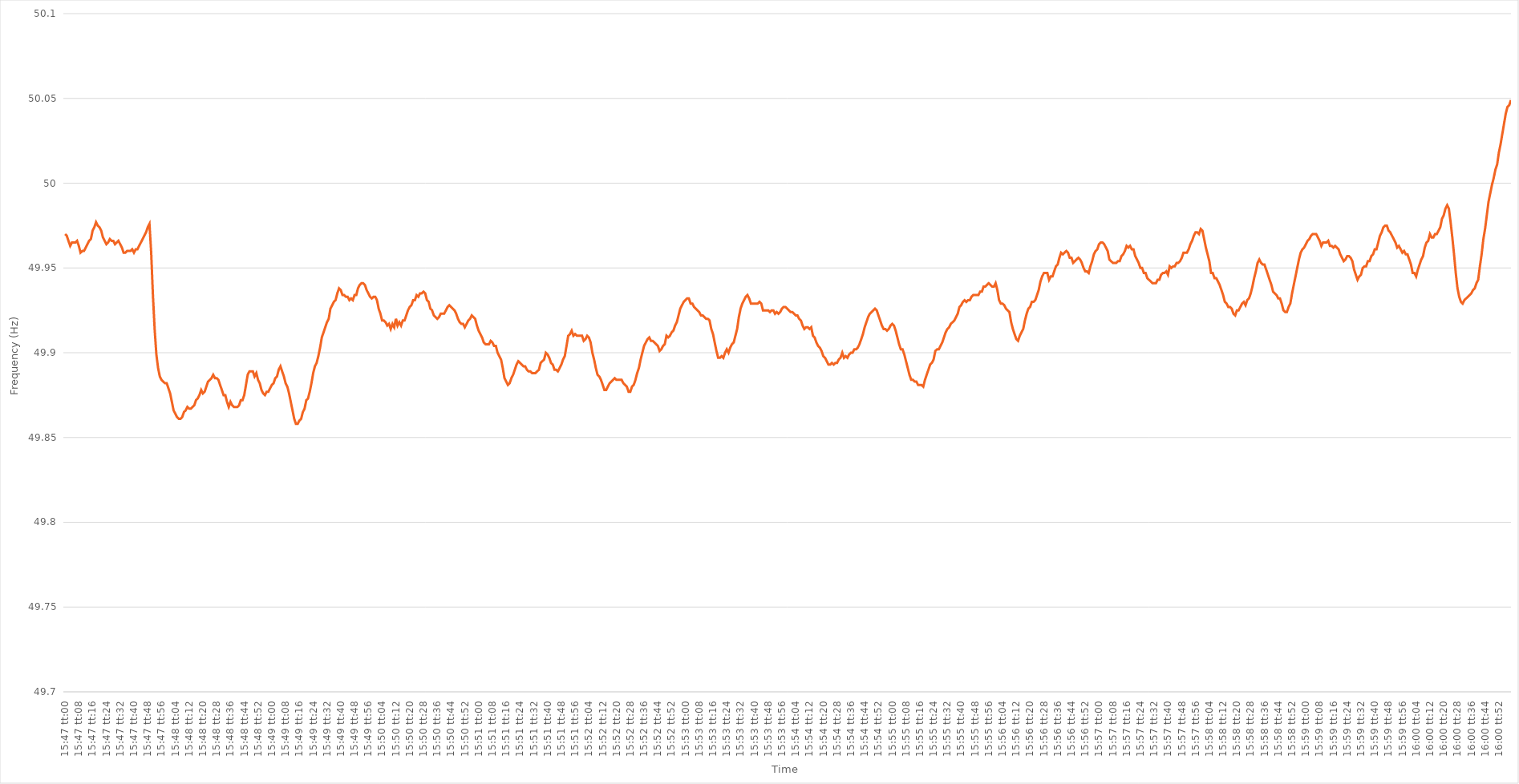
| Category | Series 0 |
|---|---|
| 0.6576388888888889 | 49.97 |
| 0.657650462962963 | 49.969 |
| 0.6576620370370371 | 49.966 |
| 0.6576736111111111 | 49.963 |
| 0.6576851851851852 | 49.965 |
| 0.6576967592592592 | 49.965 |
| 0.6577083333333333 | 49.965 |
| 0.6577199074074074 | 49.966 |
| 0.6577314814814815 | 49.963 |
| 0.6577430555555556 | 49.959 |
| 0.6577546296296296 | 49.96 |
| 0.6577662037037036 | 49.96 |
| 0.6577777777777778 | 49.962 |
| 0.6577893518518518 | 49.964 |
| 0.657800925925926 | 49.966 |
| 0.6578125 | 49.967 |
| 0.6578240740740741 | 49.972 |
| 0.6578356481481481 | 49.974 |
| 0.6578472222222222 | 49.977 |
| 0.6578587962962963 | 49.975 |
| 0.6578703703703704 | 49.974 |
| 0.6578819444444445 | 49.972 |
| 0.6578935185185185 | 49.968 |
| 0.6579050925925926 | 49.966 |
| 0.6579166666666666 | 49.964 |
| 0.6579282407407407 | 49.965 |
| 0.6579398148148148 | 49.967 |
| 0.6579513888888889 | 49.966 |
| 0.657962962962963 | 49.966 |
| 0.657974537037037 | 49.964 |
| 0.657986111111111 | 49.965 |
| 0.6579976851851852 | 49.966 |
| 0.6580092592592592 | 49.964 |
| 0.6580208333333334 | 49.962 |
| 0.6580324074074074 | 49.959 |
| 0.6580439814814815 | 49.959 |
| 0.6580555555555555 | 49.96 |
| 0.6580671296296297 | 49.96 |
| 0.6580787037037037 | 49.96 |
| 0.6580902777777778 | 49.961 |
| 0.6581018518518519 | 49.959 |
| 0.6581134259259259 | 49.961 |
| 0.658125 | 49.961 |
| 0.6581365740740741 | 49.963 |
| 0.6581481481481481 | 49.965 |
| 0.6581597222222222 | 49.967 |
| 0.6581712962962963 | 49.969 |
| 0.6581828703703704 | 49.971 |
| 0.6581944444444444 | 49.974 |
| 0.6582060185185185 | 49.976 |
| 0.6582175925925926 | 49.959 |
| 0.6582291666666666 | 49.934 |
| 0.6582407407407408 | 49.914 |
| 0.6582523148148148 | 49.899 |
| 0.6582638888888889 | 49.891 |
| 0.6582754629629629 | 49.886 |
| 0.6582870370370371 | 49.884 |
| 0.6582986111111111 | 49.883 |
| 0.6583101851851852 | 49.882 |
| 0.6583217592592593 | 49.882 |
| 0.6583333333333333 | 49.879 |
| 0.6583449074074074 | 49.876 |
| 0.6583564814814815 | 49.871 |
| 0.6583680555555556 | 49.866 |
| 0.6583796296296297 | 49.864 |
| 0.6583912037037037 | 49.862 |
| 0.6584027777777778 | 49.861 |
| 0.6584143518518518 | 49.861 |
| 0.6584259259259259 | 49.862 |
| 0.6584375 | 49.865 |
| 0.658449074074074 | 49.866 |
| 0.6584606481481482 | 49.868 |
| 0.6584722222222222 | 49.867 |
| 0.6584837962962963 | 49.867 |
| 0.6584953703703703 | 49.868 |
| 0.6585069444444445 | 49.869 |
| 0.6585185185185185 | 49.872 |
| 0.6585300925925927 | 49.873 |
| 0.6585416666666667 | 49.875 |
| 0.6585532407407407 | 49.878 |
| 0.6585648148148148 | 49.876 |
| 0.6585763888888889 | 49.877 |
| 0.658587962962963 | 49.88 |
| 0.6585995370370371 | 49.883 |
| 0.6586111111111111 | 49.884 |
| 0.6586226851851852 | 49.885 |
| 0.6586342592592592 | 49.887 |
| 0.6586458333333333 | 49.885 |
| 0.6586574074074074 | 49.885 |
| 0.6586689814814815 | 49.884 |
| 0.6586805555555556 | 49.881 |
| 0.6586921296296296 | 49.878 |
| 0.6587037037037037 | 49.875 |
| 0.6587152777777777 | 49.875 |
| 0.6587268518518519 | 49.871 |
| 0.6587384259259259 | 49.868 |
| 0.6587500000000001 | 49.871 |
| 0.6587615740740741 | 49.869 |
| 0.6587731481481481 | 49.868 |
| 0.6587847222222222 | 49.868 |
| 0.6587962962962963 | 49.868 |
| 0.6588078703703704 | 49.869 |
| 0.6588194444444445 | 49.872 |
| 0.6588310185185186 | 49.872 |
| 0.6588425925925926 | 49.875 |
| 0.6588541666666666 | 49.881 |
| 0.6588657407407407 | 49.887 |
| 0.6588773148148148 | 49.889 |
| 0.6588888888888889 | 49.889 |
| 0.658900462962963 | 49.889 |
| 0.658912037037037 | 49.886 |
| 0.6589236111111111 | 49.888 |
| 0.6589351851851851 | 49.884 |
| 0.6589467592592593 | 49.882 |
| 0.6589583333333333 | 49.878 |
| 0.6589699074074075 | 49.876 |
| 0.6589814814814815 | 49.875 |
| 0.6589930555555555 | 49.877 |
| 0.6590046296296296 | 49.877 |
| 0.6590162037037037 | 49.879 |
| 0.6590277777777778 | 49.881 |
| 0.6590393518518519 | 49.882 |
| 0.659050925925926 | 49.885 |
| 0.6590625 | 49.886 |
| 0.659074074074074 | 49.89 |
| 0.6590856481481482 | 49.892 |
| 0.6590972222222222 | 49.889 |
| 0.6591087962962963 | 49.886 |
| 0.6591203703703704 | 49.882 |
| 0.6591319444444445 | 49.88 |
| 0.6591435185185185 | 49.876 |
| 0.6591550925925925 | 49.871 |
| 0.6591666666666667 | 49.866 |
| 0.6591782407407407 | 49.861 |
| 0.6591898148148149 | 49.858 |
| 0.6592013888888889 | 49.858 |
| 0.659212962962963 | 49.86 |
| 0.659224537037037 | 49.861 |
| 0.6592361111111111 | 49.865 |
| 0.6592476851851852 | 49.867 |
| 0.6592592592592593 | 49.872 |
| 0.6592708333333334 | 49.873 |
| 0.6592824074074074 | 49.877 |
| 0.6592939814814814 | 49.882 |
| 0.6593055555555556 | 49.888 |
| 0.6593171296296296 | 49.892 |
| 0.6593287037037037 | 49.894 |
| 0.6593402777777778 | 49.898 |
| 0.6593518518518519 | 49.903 |
| 0.6593634259259259 | 49.909 |
| 0.6593749999999999 | 49.912 |
| 0.6593865740740741 | 49.915 |
| 0.6593981481481481 | 49.918 |
| 0.6594097222222223 | 49.92 |
| 0.6594212962962963 | 49.926 |
| 0.6594328703703703 | 49.928 |
| 0.6594444444444444 | 49.93 |
| 0.6594560185185185 | 49.931 |
| 0.6594675925925926 | 49.935 |
| 0.6594791666666667 | 49.938 |
| 0.6594907407407408 | 49.937 |
| 0.6595023148148148 | 49.934 |
| 0.6595138888888888 | 49.934 |
| 0.659525462962963 | 49.933 |
| 0.659537037037037 | 49.933 |
| 0.6595486111111112 | 49.931 |
| 0.6595601851851852 | 49.932 |
| 0.6595717592592593 | 49.931 |
| 0.6595833333333333 | 49.934 |
| 0.6595949074074073 | 49.934 |
| 0.6596064814814815 | 49.938 |
| 0.6596180555555555 | 49.94 |
| 0.6596296296296297 | 49.941 |
| 0.6596412037037037 | 49.941 |
| 0.6596527777777778 | 49.94 |
| 0.6596643518518518 | 49.937 |
| 0.6596759259259259 | 49.935 |
| 0.6596875 | 49.933 |
| 0.6596990740740741 | 49.932 |
| 0.6597106481481482 | 49.933 |
| 0.6597222222222222 | 49.933 |
| 0.6597337962962962 | 49.931 |
| 0.6597453703703704 | 49.926 |
| 0.6597569444444444 | 49.923 |
| 0.6597685185185186 | 49.919 |
| 0.6597800925925926 | 49.919 |
| 0.6597916666666667 | 49.918 |
| 0.6598032407407407 | 49.916 |
| 0.6598148148148147 | 49.917 |
| 0.6598263888888889 | 49.914 |
| 0.6598379629629629 | 49.917 |
| 0.6598495370370371 | 49.915 |
| 0.6598611111111111 | 49.92 |
| 0.6598726851851852 | 49.916 |
| 0.6598842592592592 | 49.918 |
| 0.6598958333333333 | 49.916 |
| 0.6599074074074074 | 49.919 |
| 0.6599189814814815 | 49.919 |
| 0.6599305555555556 | 49.922 |
| 0.6599421296296296 | 49.925 |
| 0.6599537037037037 | 49.927 |
| 0.6599652777777778 | 49.928 |
| 0.6599768518518518 | 49.931 |
| 0.659988425925926 | 49.931 |
| 0.66 | 49.934 |
| 0.6600115740740741 | 49.933 |
| 0.6600231481481481 | 49.935 |
| 0.6600347222222223 | 49.935 |
| 0.6600462962962963 | 49.936 |
| 0.6600578703703703 | 49.935 |
| 0.6600694444444445 | 49.931 |
| 0.6600810185185185 | 49.93 |
| 0.6600925925925926 | 49.926 |
| 0.6601041666666666 | 49.925 |
| 0.6601157407407408 | 49.922 |
| 0.6601273148148148 | 49.921 |
| 0.6601388888888889 | 49.92 |
| 0.660150462962963 | 49.921 |
| 0.660162037037037 | 49.923 |
| 0.6601736111111111 | 49.923 |
| 0.6601851851851852 | 49.923 |
| 0.6601967592592592 | 49.925 |
| 0.6602083333333334 | 49.927 |
| 0.6602199074074074 | 49.928 |
| 0.6602314814814815 | 49.927 |
| 0.6602430555555555 | 49.926 |
| 0.6602546296296297 | 49.925 |
| 0.6602662037037037 | 49.923 |
| 0.6602777777777777 | 49.92 |
| 0.6602893518518519 | 49.918 |
| 0.6603009259259259 | 49.917 |
| 0.6603125 | 49.917 |
| 0.660324074074074 | 49.915 |
| 0.6603356481481482 | 49.917 |
| 0.6603472222222222 | 49.919 |
| 0.6603587962962963 | 49.92 |
| 0.6603703703703704 | 49.922 |
| 0.6603819444444444 | 49.921 |
| 0.6603935185185185 | 49.92 |
| 0.6604050925925926 | 49.916 |
| 0.6604166666666667 | 49.913 |
| 0.6604282407407408 | 49.911 |
| 0.6604398148148148 | 49.909 |
| 0.6604513888888889 | 49.906 |
| 0.6604629629629629 | 49.905 |
| 0.6604745370370371 | 49.905 |
| 0.6604861111111111 | 49.905 |
| 0.6604976851851853 | 49.907 |
| 0.6605092592592593 | 49.906 |
| 0.6605208333333333 | 49.904 |
| 0.6605324074074074 | 49.904 |
| 0.6605439814814814 | 49.9 |
| 0.6605555555555556 | 49.898 |
| 0.6605671296296296 | 49.896 |
| 0.6605787037037038 | 49.891 |
| 0.6605902777777778 | 49.885 |
| 0.6606018518518518 | 49.883 |
| 0.6606134259259259 | 49.881 |
| 0.660625 | 49.882 |
| 0.6606365740740741 | 49.885 |
| 0.6606481481481482 | 49.887 |
| 0.6606597222222222 | 49.89 |
| 0.6606712962962963 | 49.893 |
| 0.6606828703703703 | 49.895 |
| 0.6606944444444445 | 49.894 |
| 0.6607060185185185 | 49.893 |
| 0.6607175925925927 | 49.892 |
| 0.6607291666666667 | 49.892 |
| 0.6607407407407407 | 49.89 |
| 0.6607523148148148 | 49.889 |
| 0.6607638888888888 | 49.889 |
| 0.660775462962963 | 49.888 |
| 0.660787037037037 | 49.888 |
| 0.6607986111111112 | 49.888 |
| 0.6608101851851852 | 49.889 |
| 0.6608217592592592 | 49.89 |
| 0.6608333333333333 | 49.894 |
| 0.6608449074074074 | 49.895 |
| 0.6608564814814815 | 49.896 |
| 0.6608680555555556 | 49.9 |
| 0.6608796296296297 | 49.899 |
| 0.6608912037037037 | 49.897 |
| 0.6609027777777777 | 49.894 |
| 0.6609143518518519 | 49.893 |
| 0.6609259259259259 | 49.89 |
| 0.6609375000000001 | 49.89 |
| 0.6609490740740741 | 49.889 |
| 0.6609606481481481 | 49.891 |
| 0.6609722222222222 | 49.893 |
| 0.6609837962962963 | 49.896 |
| 0.6609953703703704 | 49.898 |
| 0.6610069444444444 | 49.904 |
| 0.6610185185185186 | 49.91 |
| 0.6610300925925926 | 49.911 |
| 0.6610416666666666 | 49.913 |
| 0.6610532407407407 | 49.91 |
| 0.6610648148148148 | 49.911 |
| 0.6610763888888889 | 49.91 |
| 0.661087962962963 | 49.91 |
| 0.661099537037037 | 49.91 |
| 0.6611111111111111 | 49.91 |
| 0.6611226851851851 | 49.907 |
| 0.6611342592592593 | 49.908 |
| 0.6611458333333333 | 49.91 |
| 0.6611574074074075 | 49.909 |
| 0.6611689814814815 | 49.906 |
| 0.6611805555555555 | 49.9 |
| 0.6611921296296296 | 49.896 |
| 0.6612037037037037 | 49.891 |
| 0.6612152777777778 | 49.887 |
| 0.6612268518518518 | 49.886 |
| 0.661238425925926 | 49.884 |
| 0.66125 | 49.881 |
| 0.661261574074074 | 49.878 |
| 0.6612731481481481 | 49.878 |
| 0.6612847222222222 | 49.88 |
| 0.6612962962962963 | 49.882 |
| 0.6613078703703704 | 49.883 |
| 0.6613194444444445 | 49.884 |
| 0.6613310185185185 | 49.885 |
| 0.6613425925925925 | 49.884 |
| 0.6613541666666667 | 49.884 |
| 0.6613657407407407 | 49.884 |
| 0.6613773148148149 | 49.884 |
| 0.6613888888888889 | 49.882 |
| 0.661400462962963 | 49.881 |
| 0.661412037037037 | 49.88 |
| 0.6614236111111111 | 49.877 |
| 0.6614351851851852 | 49.877 |
| 0.6614467592592593 | 49.88 |
| 0.6614583333333334 | 49.881 |
| 0.6614699074074074 | 49.884 |
| 0.6614814814814814 | 49.888 |
| 0.6614930555555555 | 49.891 |
| 0.6615046296296296 | 49.896 |
| 0.6615162037037037 | 49.9 |
| 0.6615277777777778 | 49.904 |
| 0.6615393518518519 | 49.906 |
| 0.6615509259259259 | 49.908 |
| 0.6615624999999999 | 49.909 |
| 0.6615740740740741 | 49.907 |
| 0.6615856481481481 | 49.907 |
| 0.6615972222222223 | 49.906 |
| 0.6616087962962963 | 49.905 |
| 0.6616203703703704 | 49.904 |
| 0.6616319444444444 | 49.901 |
| 0.6616435185185185 | 49.902 |
| 0.6616550925925926 | 49.904 |
| 0.6616666666666667 | 49.905 |
| 0.6616782407407408 | 49.91 |
| 0.6616898148148148 | 49.909 |
| 0.6617013888888889 | 49.91 |
| 0.6617129629629629 | 49.912 |
| 0.661724537037037 | 49.913 |
| 0.6617361111111111 | 49.916 |
| 0.6617476851851852 | 49.918 |
| 0.6617592592592593 | 49.922 |
| 0.6617708333333333 | 49.926 |
| 0.6617824074074073 | 49.928 |
| 0.6617939814814815 | 49.93 |
| 0.6618055555555555 | 49.931 |
| 0.6618171296296297 | 49.932 |
| 0.6618287037037037 | 49.932 |
| 0.6618402777777778 | 49.929 |
| 0.6618518518518518 | 49.929 |
| 0.661863425925926 | 49.927 |
| 0.661875 | 49.926 |
| 0.6618865740740741 | 49.925 |
| 0.6618981481481482 | 49.924 |
| 0.6619097222222222 | 49.922 |
| 0.6619212962962963 | 49.922 |
| 0.6619328703703703 | 49.921 |
| 0.6619444444444444 | 49.92 |
| 0.6619560185185185 | 49.92 |
| 0.6619675925925926 | 49.919 |
| 0.6619791666666667 | 49.914 |
| 0.6619907407407407 | 49.911 |
| 0.6620023148148148 | 49.906 |
| 0.6620138888888889 | 49.901 |
| 0.6620254629629629 | 49.897 |
| 0.6620370370370371 | 49.897 |
| 0.6620486111111111 | 49.898 |
| 0.6620601851851852 | 49.897 |
| 0.6620717592592592 | 49.9 |
| 0.6620833333333334 | 49.902 |
| 0.6620949074074074 | 49.9 |
| 0.6621064814814815 | 49.903 |
| 0.6621180555555556 | 49.905 |
| 0.6621296296296296 | 49.906 |
| 0.6621412037037037 | 49.91 |
| 0.6621527777777778 | 49.914 |
| 0.6621643518518519 | 49.921 |
| 0.6621759259259259 | 49.926 |
| 0.6621875 | 49.929 |
| 0.6621990740740741 | 49.931 |
| 0.6622106481481481 | 49.933 |
| 0.6622222222222222 | 49.934 |
| 0.6622337962962963 | 49.932 |
| 0.6622453703703703 | 49.929 |
| 0.6622569444444445 | 49.929 |
| 0.6622685185185185 | 49.929 |
| 0.6622800925925926 | 49.929 |
| 0.6622916666666666 | 49.929 |
| 0.6623032407407408 | 49.93 |
| 0.6623148148148148 | 49.929 |
| 0.662326388888889 | 49.925 |
| 0.662337962962963 | 49.925 |
| 0.662349537037037 | 49.925 |
| 0.6623611111111111 | 49.925 |
| 0.6623726851851852 | 49.924 |
| 0.6623842592592593 | 49.925 |
| 0.6623958333333334 | 49.925 |
| 0.6624074074074074 | 49.923 |
| 0.6624189814814815 | 49.924 |
| 0.6624305555555555 | 49.923 |
| 0.6624421296296296 | 49.924 |
| 0.6624537037037037 | 49.926 |
| 0.6624652777777778 | 49.927 |
| 0.6624768518518519 | 49.927 |
| 0.6624884259259259 | 49.926 |
| 0.6625 | 49.925 |
| 0.662511574074074 | 49.924 |
| 0.6625231481481482 | 49.924 |
| 0.6625347222222222 | 49.923 |
| 0.6625462962962964 | 49.922 |
| 0.6625578703703704 | 49.922 |
| 0.6625694444444444 | 49.92 |
| 0.6625810185185185 | 49.919 |
| 0.6625925925925926 | 49.916 |
| 0.6626041666666667 | 49.914 |
| 0.6626157407407408 | 49.915 |
| 0.6626273148148148 | 49.915 |
| 0.6626388888888889 | 49.914 |
| 0.6626504629629629 | 49.915 |
| 0.662662037037037 | 49.91 |
| 0.6626736111111111 | 49.909 |
| 0.6626851851851852 | 49.906 |
| 0.6626967592592593 | 49.904 |
| 0.6627083333333333 | 49.903 |
| 0.6627199074074074 | 49.901 |
| 0.6627314814814814 | 49.898 |
| 0.6627430555555556 | 49.897 |
| 0.6627546296296296 | 49.895 |
| 0.6627662037037038 | 49.893 |
| 0.6627777777777778 | 49.893 |
| 0.6627893518518518 | 49.894 |
| 0.6628009259259259 | 49.893 |
| 0.6628125 | 49.894 |
| 0.6628240740740741 | 49.894 |
| 0.6628356481481482 | 49.896 |
| 0.6628472222222223 | 49.897 |
| 0.6628587962962963 | 49.9 |
| 0.6628703703703703 | 49.897 |
| 0.6628819444444444 | 49.898 |
| 0.6628935185185185 | 49.897 |
| 0.6629050925925926 | 49.899 |
| 0.6629166666666667 | 49.9 |
| 0.6629282407407407 | 49.9 |
| 0.6629398148148148 | 49.902 |
| 0.6629513888888888 | 49.902 |
| 0.662962962962963 | 49.903 |
| 0.662974537037037 | 49.905 |
| 0.6629861111111112 | 49.908 |
| 0.6629976851851852 | 49.911 |
| 0.6630092592592592 | 49.915 |
| 0.6630208333333333 | 49.918 |
| 0.6630324074074074 | 49.921 |
| 0.6630439814814815 | 49.923 |
| 0.6630555555555556 | 49.924 |
| 0.6630671296296297 | 49.925 |
| 0.6630787037037037 | 49.926 |
| 0.6630902777777777 | 49.925 |
| 0.6631018518518519 | 49.922 |
| 0.6631134259259259 | 49.919 |
| 0.663125 | 49.916 |
| 0.6631365740740741 | 49.914 |
| 0.6631481481481482 | 49.914 |
| 0.6631597222222222 | 49.913 |
| 0.6631712962962962 | 49.914 |
| 0.6631828703703704 | 49.916 |
| 0.6631944444444444 | 49.917 |
| 0.6632060185185186 | 49.916 |
| 0.6632175925925926 | 49.913 |
| 0.6632291666666666 | 49.909 |
| 0.6632407407407407 | 49.905 |
| 0.6632523148148148 | 49.902 |
| 0.6632638888888889 | 49.902 |
| 0.663275462962963 | 49.899 |
| 0.6632870370370371 | 49.895 |
| 0.6632986111111111 | 49.891 |
| 0.6633101851851851 | 49.887 |
| 0.6633217592592593 | 49.884 |
| 0.6633333333333333 | 49.884 |
| 0.6633449074074075 | 49.883 |
| 0.6633564814814815 | 49.883 |
| 0.6633680555555556 | 49.881 |
| 0.6633796296296296 | 49.881 |
| 0.6633912037037036 | 49.881 |
| 0.6634027777777778 | 49.88 |
| 0.6634143518518518 | 49.884 |
| 0.663425925925926 | 49.887 |
| 0.6634375 | 49.89 |
| 0.663449074074074 | 49.893 |
| 0.6634606481481481 | 49.894 |
| 0.6634722222222222 | 49.896 |
| 0.6634837962962963 | 49.901 |
| 0.6634953703703704 | 49.902 |
| 0.6635069444444445 | 49.902 |
| 0.6635185185185185 | 49.904 |
| 0.6635300925925925 | 49.906 |
| 0.6635416666666667 | 49.909 |
| 0.6635532407407407 | 49.912 |
| 0.6635648148148149 | 49.914 |
| 0.6635763888888889 | 49.915 |
| 0.663587962962963 | 49.917 |
| 0.663599537037037 | 49.918 |
| 0.663611111111111 | 49.919 |
| 0.6636226851851852 | 49.921 |
| 0.6636342592592592 | 49.923 |
| 0.6636458333333334 | 49.927 |
| 0.6636574074074074 | 49.928 |
| 0.6636689814814815 | 49.93 |
| 0.6636805555555555 | 49.931 |
| 0.6636921296296296 | 49.93 |
| 0.6637037037037037 | 49.931 |
| 0.6637152777777778 | 49.931 |
| 0.6637268518518519 | 49.933 |
| 0.6637384259259259 | 49.934 |
| 0.66375 | 49.934 |
| 0.6637615740740741 | 49.934 |
| 0.6637731481481481 | 49.934 |
| 0.6637847222222223 | 49.936 |
| 0.6637962962962963 | 49.936 |
| 0.6638078703703704 | 49.939 |
| 0.6638194444444444 | 49.939 |
| 0.6638310185185184 | 49.94 |
| 0.6638425925925926 | 49.941 |
| 0.6638541666666666 | 49.94 |
| 0.6638657407407408 | 49.939 |
| 0.6638773148148148 | 49.939 |
| 0.6638888888888889 | 49.941 |
| 0.6639004629629629 | 49.937 |
| 0.663912037037037 | 49.931 |
| 0.6639236111111111 | 49.929 |
| 0.6639351851851852 | 49.929 |
| 0.6639467592592593 | 49.928 |
| 0.6639583333333333 | 49.926 |
| 0.6639699074074074 | 49.925 |
| 0.6639814814814815 | 49.924 |
| 0.6639930555555555 | 49.918 |
| 0.6640046296296297 | 49.914 |
| 0.6640162037037037 | 49.911 |
| 0.6640277777777778 | 49.908 |
| 0.6640393518518518 | 49.907 |
| 0.664050925925926 | 49.91 |
| 0.6640625 | 49.912 |
| 0.664074074074074 | 49.914 |
| 0.6640856481481482 | 49.919 |
| 0.6640972222222222 | 49.923 |
| 0.6641087962962963 | 49.926 |
| 0.6641203703703703 | 49.927 |
| 0.6641319444444445 | 49.93 |
| 0.6641435185185185 | 49.93 |
| 0.6641550925925926 | 49.931 |
| 0.6641666666666667 | 49.934 |
| 0.6641782407407407 | 49.937 |
| 0.6641898148148148 | 49.942 |
| 0.6642013888888889 | 49.945 |
| 0.664212962962963 | 49.947 |
| 0.6642245370370371 | 49.947 |
| 0.6642361111111111 | 49.947 |
| 0.6642476851851852 | 49.943 |
| 0.6642592592592592 | 49.945 |
| 0.6642708333333334 | 49.945 |
| 0.6642824074074074 | 49.948 |
| 0.6642939814814816 | 49.951 |
| 0.6643055555555556 | 49.952 |
| 0.6643171296296296 | 49.956 |
| 0.6643287037037037 | 49.959 |
| 0.6643402777777777 | 49.958 |
| 0.6643518518518519 | 49.959 |
| 0.6643634259259259 | 49.96 |
| 0.664375 | 49.959 |
| 0.6643865740740741 | 49.956 |
| 0.6643981481481481 | 49.956 |
| 0.6644097222222222 | 49.953 |
| 0.6644212962962963 | 49.954 |
| 0.6644328703703704 | 49.955 |
| 0.6644444444444445 | 49.956 |
| 0.6644560185185185 | 49.955 |
| 0.6644675925925926 | 49.953 |
| 0.6644791666666666 | 49.95 |
| 0.6644907407407408 | 49.948 |
| 0.6645023148148148 | 49.948 |
| 0.664513888888889 | 49.947 |
| 0.664525462962963 | 49.951 |
| 0.664537037037037 | 49.954 |
| 0.6645486111111111 | 49.958 |
| 0.6645601851851851 | 49.96 |
| 0.6645717592592593 | 49.961 |
| 0.6645833333333333 | 49.964 |
| 0.6645949074074075 | 49.965 |
| 0.6646064814814815 | 49.965 |
| 0.6646180555555555 | 49.964 |
| 0.6646296296296296 | 49.962 |
| 0.6646412037037037 | 49.96 |
| 0.6646527777777778 | 49.955 |
| 0.6646643518518519 | 49.954 |
| 0.664675925925926 | 49.953 |
| 0.6646875 | 49.953 |
| 0.664699074074074 | 49.953 |
| 0.6647106481481482 | 49.954 |
| 0.6647222222222222 | 49.954 |
| 0.6647337962962964 | 49.957 |
| 0.6647453703703704 | 49.958 |
| 0.6647569444444444 | 49.96 |
| 0.6647685185185185 | 49.963 |
| 0.6647800925925925 | 49.962 |
| 0.6647916666666667 | 49.963 |
| 0.6648032407407407 | 49.961 |
| 0.6648148148148149 | 49.961 |
| 0.6648263888888889 | 49.957 |
| 0.6648379629629629 | 49.955 |
| 0.664849537037037 | 49.953 |
| 0.6648611111111111 | 49.95 |
| 0.6648726851851852 | 49.95 |
| 0.6648842592592593 | 49.947 |
| 0.6648958333333334 | 49.947 |
| 0.6649074074074074 | 49.944 |
| 0.6649189814814814 | 49.943 |
| 0.6649305555555556 | 49.942 |
| 0.6649421296296296 | 49.941 |
| 0.6649537037037038 | 49.941 |
| 0.6649652777777778 | 49.941 |
| 0.6649768518518518 | 49.943 |
| 0.6649884259259259 | 49.943 |
| 0.665 | 49.946 |
| 0.6650115740740741 | 49.947 |
| 0.6650231481481481 | 49.947 |
| 0.6650347222222223 | 49.948 |
| 0.6650462962962963 | 49.946 |
| 0.6650578703703703 | 49.951 |
| 0.6650694444444444 | 49.95 |
| 0.6650810185185185 | 49.951 |
| 0.6650925925925926 | 49.951 |
| 0.6651041666666667 | 49.953 |
| 0.6651157407407408 | 49.953 |
| 0.6651273148148148 | 49.954 |
| 0.6651388888888888 | 49.956 |
| 0.665150462962963 | 49.959 |
| 0.665162037037037 | 49.959 |
| 0.6651736111111112 | 49.959 |
| 0.6651851851851852 | 49.961 |
| 0.6651967592592593 | 49.964 |
| 0.6652083333333333 | 49.966 |
| 0.6652199074074074 | 49.969 |
| 0.6652314814814815 | 49.971 |
| 0.6652430555555556 | 49.971 |
| 0.6652546296296297 | 49.97 |
| 0.6652662037037037 | 49.973 |
| 0.6652777777777777 | 49.972 |
| 0.6652893518518518 | 49.967 |
| 0.6653009259259259 | 49.962 |
| 0.6653125 | 49.958 |
| 0.6653240740740741 | 49.954 |
| 0.6653356481481482 | 49.947 |
| 0.6653472222222222 | 49.947 |
| 0.6653587962962962 | 49.944 |
| 0.6653703703703704 | 49.944 |
| 0.6653819444444444 | 49.942 |
| 0.6653935185185186 | 49.94 |
| 0.6654050925925926 | 49.937 |
| 0.6654166666666667 | 49.934 |
| 0.6654282407407407 | 49.93 |
| 0.6654398148148148 | 49.929 |
| 0.6654513888888889 | 49.927 |
| 0.665462962962963 | 49.927 |
| 0.6654745370370371 | 49.926 |
| 0.6654861111111111 | 49.923 |
| 0.6654976851851852 | 49.922 |
| 0.6655092592592592 | 49.925 |
| 0.6655208333333333 | 49.925 |
| 0.6655324074074074 | 49.927 |
| 0.6655439814814815 | 49.929 |
| 0.6655555555555556 | 49.93 |
| 0.6655671296296296 | 49.928 |
| 0.6655787037037036 | 49.931 |
| 0.6655902777777778 | 49.932 |
| 0.6656018518518518 | 49.935 |
| 0.665613425925926 | 49.939 |
| 0.665625 | 49.944 |
| 0.6656365740740741 | 49.948 |
| 0.6656481481481481 | 49.953 |
| 0.6656597222222222 | 49.955 |
| 0.6656712962962963 | 49.953 |
| 0.6656828703703704 | 49.952 |
| 0.6656944444444445 | 49.952 |
| 0.6657060185185185 | 49.949 |
| 0.6657175925925926 | 49.946 |
| 0.6657291666666666 | 49.943 |
| 0.6657407407407407 | 49.94 |
| 0.6657523148148148 | 49.936 |
| 0.6657638888888889 | 49.935 |
| 0.665775462962963 | 49.934 |
| 0.665787037037037 | 49.932 |
| 0.665798611111111 | 49.932 |
| 0.6658101851851852 | 49.929 |
| 0.6658217592592592 | 49.925 |
| 0.6658333333333334 | 49.924 |
| 0.6658449074074074 | 49.924 |
| 0.6658564814814815 | 49.927 |
| 0.6658680555555555 | 49.929 |
| 0.6658796296296297 | 49.935 |
| 0.6658912037037037 | 49.94 |
| 0.6659027777777778 | 49.945 |
| 0.6659143518518519 | 49.95 |
| 0.6659259259259259 | 49.955 |
| 0.6659375 | 49.959 |
| 0.6659490740740741 | 49.961 |
| 0.6659606481481481 | 49.962 |
| 0.6659722222222222 | 49.964 |
| 0.6659837962962963 | 49.966 |
| 0.6659953703703704 | 49.967 |
| 0.6660069444444444 | 49.969 |
| 0.6660185185185185 | 49.97 |
| 0.6660300925925926 | 49.97 |
| 0.6660416666666666 | 49.97 |
| 0.6660532407407408 | 49.968 |
| 0.6660648148148148 | 49.966 |
| 0.6660763888888889 | 49.963 |
| 0.6660879629629629 | 49.965 |
| 0.6660995370370371 | 49.965 |
| 0.6661111111111111 | 49.965 |
| 0.6661226851851852 | 49.966 |
| 0.6661342592592593 | 49.963 |
| 0.6661458333333333 | 49.963 |
| 0.6661574074074074 | 49.962 |
| 0.6661689814814815 | 49.963 |
| 0.6661805555555556 | 49.962 |
| 0.6661921296296297 | 49.961 |
| 0.6662037037037037 | 49.958 |
| 0.6662152777777778 | 49.956 |
| 0.6662268518518518 | 49.954 |
| 0.6662384259259259 | 49.955 |
| 0.66625 | 49.957 |
| 0.666261574074074 | 49.957 |
| 0.6662731481481482 | 49.956 |
| 0.6662847222222222 | 49.954 |
| 0.6662962962962963 | 49.949 |
| 0.6663078703703703 | 49.946 |
| 0.6663194444444445 | 49.943 |
| 0.6663310185185185 | 49.945 |
| 0.6663425925925927 | 49.946 |
| 0.6663541666666667 | 49.95 |
| 0.6663657407407407 | 49.951 |
| 0.6663773148148148 | 49.951 |
| 0.6663888888888889 | 49.954 |
| 0.666400462962963 | 49.954 |
| 0.6664120370370371 | 49.957 |
| 0.6664236111111111 | 49.958 |
| 0.6664351851851852 | 49.961 |
| 0.6664467592592592 | 49.961 |
| 0.6664583333333333 | 49.965 |
| 0.6664699074074074 | 49.969 |
| 0.6664814814814815 | 49.971 |
| 0.6664930555555556 | 49.974 |
| 0.6665046296296296 | 49.975 |
| 0.6665162037037037 | 49.975 |
| 0.6665277777777777 | 49.972 |
| 0.6665393518518519 | 49.971 |
| 0.6665509259259259 | 49.969 |
| 0.6665625000000001 | 49.967 |
| 0.6665740740740741 | 49.965 |
| 0.6665856481481481 | 49.962 |
| 0.6665972222222222 | 49.963 |
| 0.6666087962962963 | 49.961 |
| 0.6666203703703704 | 49.959 |
| 0.6666319444444445 | 49.96 |
| 0.6666435185185186 | 49.958 |
| 0.6666550925925926 | 49.958 |
| 0.6666666666666666 | 49.955 |
| 0.6666782407407408 | 49.952 |
| 0.6666898148148147 | 49.947 |
| 0.6667013888888889 | 49.947 |
| 0.666712962962963 | 49.945 |
| 0.666724537037037 | 49.949 |
| 0.6667361111111111 | 49.952 |
| 0.6667476851851851 | 49.955 |
| 0.6667592592592593 | 49.957 |
| 0.6667708333333334 | 49.962 |
| 0.6667824074074074 | 49.965 |
| 0.6667939814814815 | 49.966 |
| 0.6668055555555555 | 49.97 |
| 0.6668171296296297 | 49.968 |
| 0.6668287037037036 | 49.968 |
| 0.6668402777777778 | 49.97 |
| 0.6668518518518519 | 49.97 |
| 0.666863425925926 | 49.972 |
| 0.666875 | 49.974 |
| 0.666886574074074 | 49.979 |
| 0.6668981481481482 | 49.981 |
| 0.6669097222222221 | 49.985 |
| 0.6669212962962963 | 49.987 |
| 0.6669328703703704 | 49.985 |
| 0.6669444444444445 | 49.977 |
| 0.6669560185185185 | 49.968 |
| 0.6669675925925925 | 49.958 |
| 0.6669791666666667 | 49.947 |
| 0.6669907407407408 | 49.938 |
| 0.6670023148148148 | 49.933 |
| 0.6670138888888889 | 49.93 |
| 0.667025462962963 | 49.929 |
| 0.6670370370370371 | 49.931 |
| 0.667048611111111 | 49.932 |
| 0.6670601851851852 | 49.933 |
| 0.6670717592592593 | 49.934 |
| 0.6670833333333334 | 49.935 |
| 0.6670949074074074 | 49.937 |
| 0.6671064814814814 | 49.938 |
| 0.6671180555555556 | 49.941 |
| 0.6671296296296297 | 49.943 |
| 0.6671412037037037 | 49.951 |
| 0.6671527777777778 | 49.958 |
| 0.6671643518518519 | 49.967 |
| 0.6671759259259259 | 49.973 |
| 0.6671874999999999 | 49.981 |
| 0.6671990740740741 | 49.989 |
| 0.6672106481481482 | 49.994 |
| 0.6672222222222222 | 49.999 |
| 0.6672337962962963 | 50.003 |
| 0.6672453703703703 | 50.008 |
| 0.6672569444444445 | 50.011 |
| 0.6672685185185184 | 50.018 |
| 0.6672800925925926 | 50.023 |
| 0.6672916666666667 | 50.029 |
| 0.6673032407407408 | 50.035 |
| 0.6673148148148148 | 50.041 |
| 0.6673263888888888 | 50.045 |
| 0.667337962962963 | 50.046 |
| 0.6673495370370371 | 50.049 |